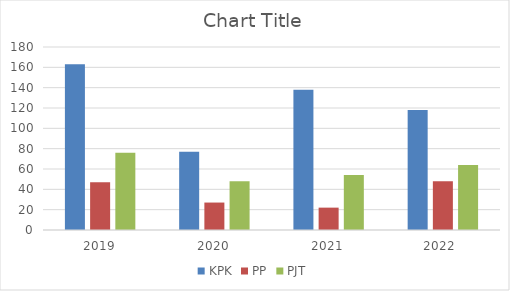
| Category | KPK | PP | PJT |
|---|---|---|---|
| 2019 | 163 | 47 | 76 |
| 2020 | 77 | 27 | 48 |
| 2021 | 138 | 22 | 54 |
| 2022  | 118 | 48 | 64 |